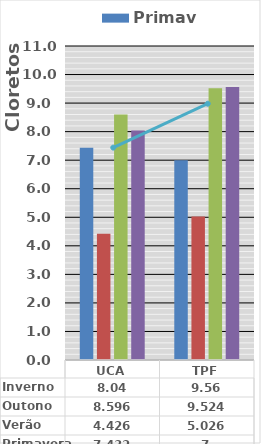
| Category | Primavera | Verão | Outono | Inverno |
|---|---|---|---|---|
| UCA | 7.432 | 4.426 | 8.596 | 8.04 |
| TPF | 7 | 5.026 | 9.524 | 9.56 |